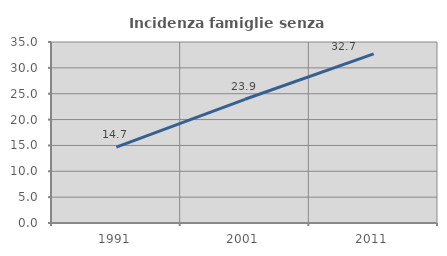
| Category | Incidenza famiglie senza nuclei |
|---|---|
| 1991.0 | 14.672 |
| 2001.0 | 23.923 |
| 2011.0 | 32.705 |